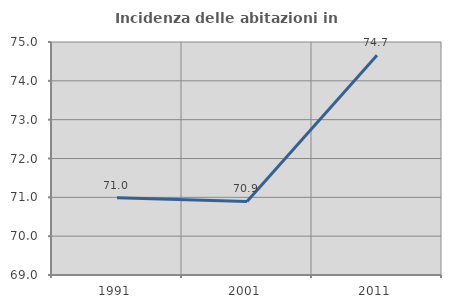
| Category | Incidenza delle abitazioni in proprietà  |
|---|---|
| 1991.0 | 70.987 |
| 2001.0 | 70.895 |
| 2011.0 | 74.658 |